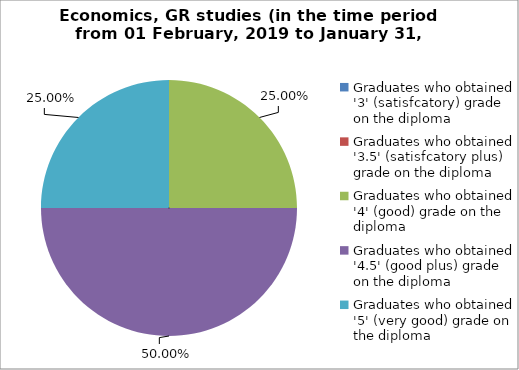
| Category | Series 0 |
|---|---|
| Graduates who obtained '3' (satisfcatory) grade on the diploma  | 0 |
| Graduates who obtained '3.5' (satisfcatory plus) grade on the diploma  | 0 |
| Graduates who obtained '4' (good) grade on the diploma  | 25 |
| Graduates who obtained '4.5' (good plus) grade on the diploma  | 50 |
| Graduates who obtained '5' (very good) grade on the diploma  | 25 |